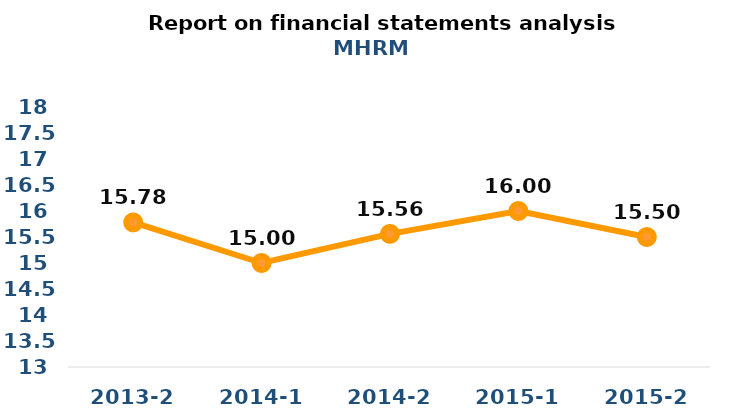
| Category | Series 0 |
|---|---|
| 2013-2 | 15.78 |
| 2014-1 | 15 |
| 2014-2 | 15.56 |
| 2015-1 | 16 |
| 2015-2 | 15.5 |